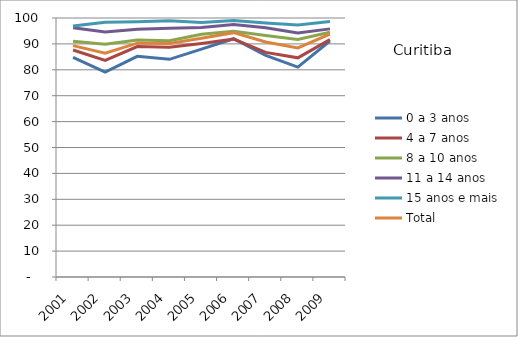
| Category | 0 a 3 anos | 4 a 7 anos | 8 a 10 anos | 11 a 14 anos | 15 anos e mais | Total |
|---|---|---|---|---|---|---|
| 2001.0 | 84.77 | 87.64 | 91.05 | 96.2 | 96.88 | 89.32 |
| 2002.0 | 79.12 | 83.61 | 89.89 | 94.56 | 98.38 | 86.44 |
| 2003.0 | 85.2 | 88.97 | 91.49 | 95.68 | 98.59 | 90.28 |
| 2004.0 | 84.04 | 88.69 | 91.25 | 96 | 98.89 | 90.2 |
| 2005.0 | 87.96 | 90.18 | 93.74 | 96.35 | 98.31 | 92.21 |
| 2006.0 | 92 | 91.89 | 94.84 | 97.47 | 99.05 | 94.34 |
| 2007.0 | 85.54 | 86.71 | 93.22 | 96.22 | 98.09 | 90.71 |
| 2008.0 | 81.04 | 84.63 | 91.68 | 94.19 | 97.32 | 88.44 |
| 2009.0 | 91.11 | 91.67 | 94.47 | 95.8 | 98.66 | 93.79 |